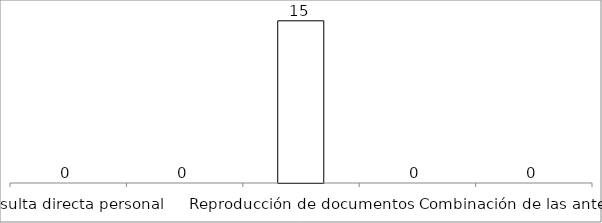
| Category | Series 0 |
|---|---|
| Consulta directa personal | 0 |
| Consulta directa electrónica | 0 |
| Reproducción de documentos | 15 |
| Elaboración de informes | 0 |
| Combinación de las anteriores | 0 |